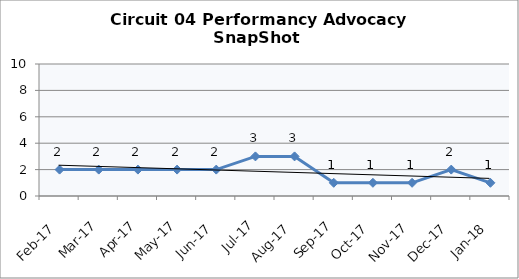
| Category | Circuit 04 |
|---|---|
| Feb-17 | 2 |
| Mar-17 | 2 |
| Apr-17 | 2 |
| May-17 | 2 |
| Jun-17 | 2 |
| Jul-17 | 3 |
| Aug-17 | 3 |
| Sep-17 | 1 |
| Oct-17 | 1 |
| Nov-17 | 1 |
| Dec-17 | 2 |
| Jan-18 | 1 |